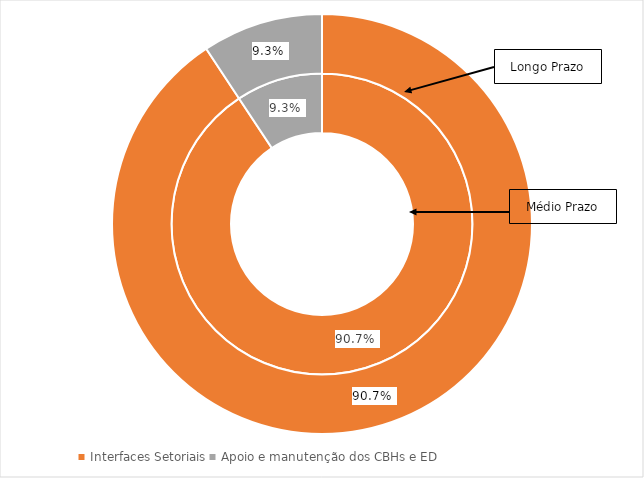
| Category | Curto Prazo (%) | Médio Prazo (%) | Longo Prazo (%) |
|---|---|---|---|
| Recursos Hídricos | 0 | 0 | 0 |
| Interfaces Setoriais | 0 | 0.907 | 0.907 |
| Apoio e manutenção dos CBHs e ED | 0 | 0.093 | 0.093 |